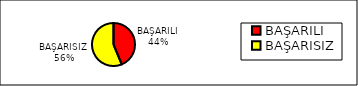
| Category | Series 0 |
|---|---|
| BAŞARILI | 14 |
| BAŞARISIZ | 18 |